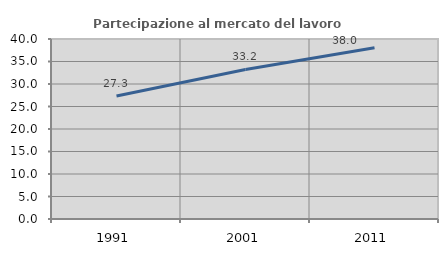
| Category | Partecipazione al mercato del lavoro  femminile |
|---|---|
| 1991.0 | 27.325 |
| 2001.0 | 33.225 |
| 2011.0 | 38.039 |